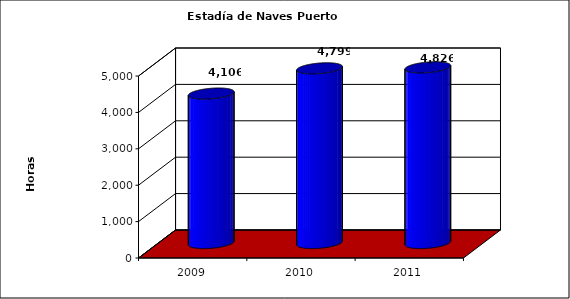
| Category | Series 0 |
|---|---|
| 2009.0 | 4105.5 |
| 2010.0 | 4799 |
| 2011.0 | 4826 |